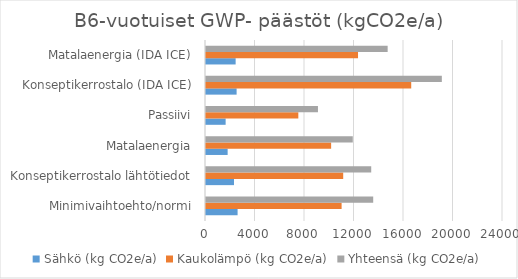
| Category | Sähkö (kg CO2e/a) | Kaukolämpö (kg CO2e/a) | Yhteensä (kg CO2e/a) |
|---|---|---|---|
| Minimivaihtoehto/normi | 2553.024 | 10958.4 | 13511.424 |
| Konseptikerrostalo lähtötiedot | 2263.44 | 11087.55 | 13350.99 |
| Matalaenergia | 1748.832 | 10111.8 | 11860.632 |
| Passiivi | 1586.496 | 7460.55 | 9047.046 |
| Konseptikerrostalo (IDA ICE) | 2473.536 | 16583.7 | 19057.236 |
| Matalaenergia (IDA ICE) | 2394.816 | 12284.4 | 14679.216 |